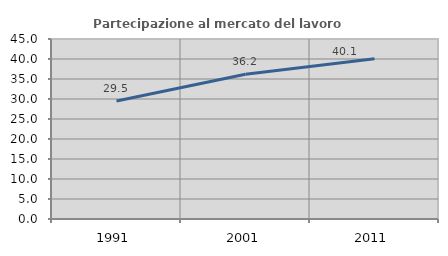
| Category | Partecipazione al mercato del lavoro  femminile |
|---|---|
| 1991.0 | 29.501 |
| 2001.0 | 36.19 |
| 2011.0 | 40.076 |